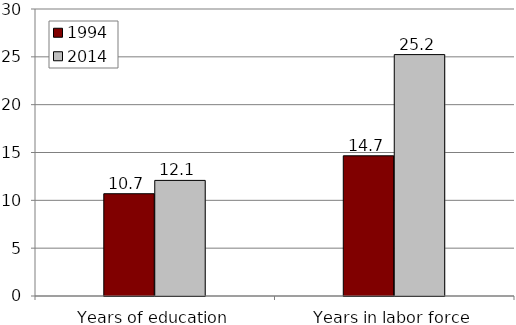
| Category | 1994 | 2014 |
|---|---|---|
| Years of education | 10.691 | 12.083 |
| Years in labor force | 14.655 | 25.233 |